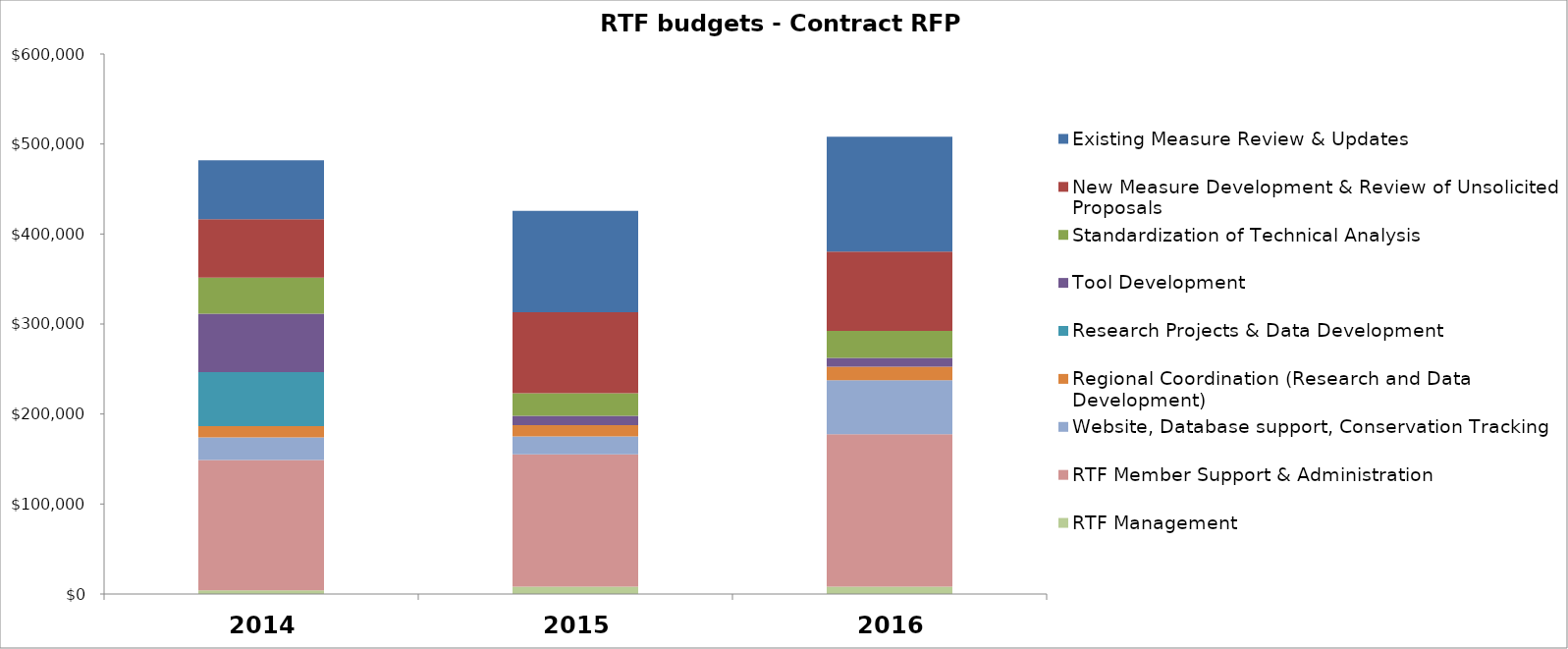
| Category | RTF Management | RTF Member Support & Administration | Website, Database support, Conservation Tracking  | Regional Coordination (Research and Data Development) | Research Projects & Data Development | Tool Development | Standardization of Technical Analysis | New Measure Development & Review of Unsolicited Proposals | Existing Measure Review & Updates |
|---|---|---|---|---|---|---|---|---|---|
| 0 | 4000 | 145000 | 25000 | 12500 | 60000 | 65000 | 40000 | 65000 | 65500 |
| 1 | 8300 | 146800 | 20000 | 12500 | 0 | 10500 | 25000 | 90000 | 112500 |
| 2 | 8300 | 169200 | 60000 | 15000 | 0 | 10000 | 30000 | 88000 | 127500 |